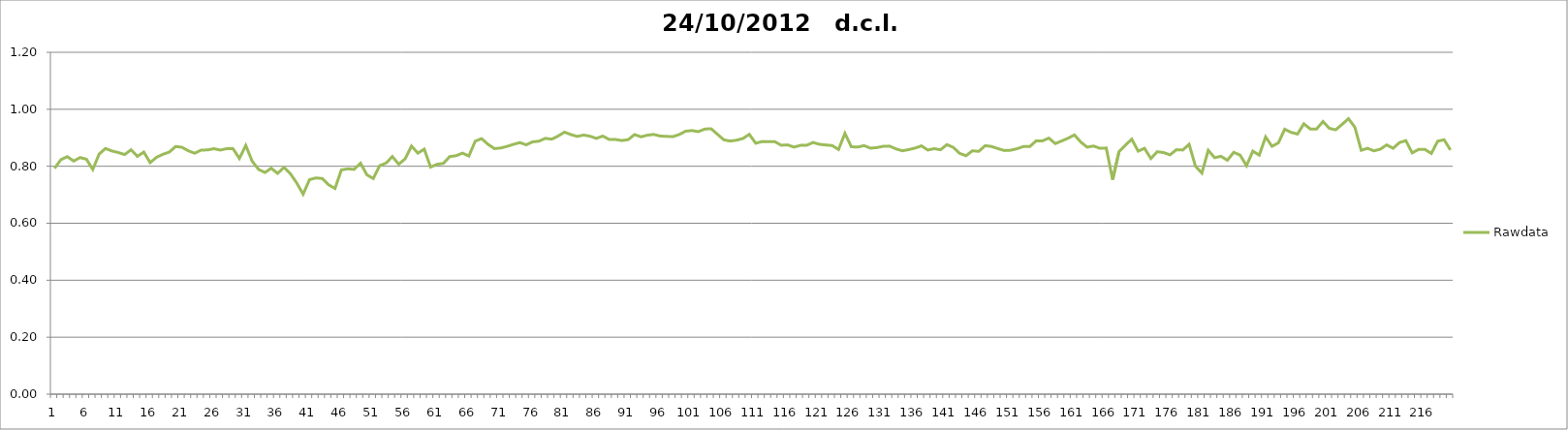
| Category | Rawdata |
|---|---|
| 0 | 0.793 |
| 1 | 0.823 |
| 2 | 0.834 |
| 3 | 0.818 |
| 4 | 0.83 |
| 5 | 0.825 |
| 6 | 0.789 |
| 7 | 0.843 |
| 8 | 0.862 |
| 9 | 0.854 |
| 10 | 0.848 |
| 11 | 0.841 |
| 12 | 0.858 |
| 13 | 0.835 |
| 14 | 0.85 |
| 15 | 0.813 |
| 16 | 0.832 |
| 17 | 0.842 |
| 18 | 0.85 |
| 19 | 0.87 |
| 20 | 0.866 |
| 21 | 0.854 |
| 22 | 0.846 |
| 23 | 0.857 |
| 24 | 0.857 |
| 25 | 0.862 |
| 26 | 0.857 |
| 27 | 0.862 |
| 28 | 0.862 |
| 29 | 0.827 |
| 30 | 0.873 |
| 31 | 0.818 |
| 32 | 0.789 |
| 33 | 0.778 |
| 34 | 0.793 |
| 35 | 0.775 |
| 36 | 0.796 |
| 37 | 0.774 |
| 38 | 0.741 |
| 39 | 0.702 |
| 40 | 0.753 |
| 41 | 0.759 |
| 42 | 0.757 |
| 43 | 0.735 |
| 44 | 0.722 |
| 45 | 0.787 |
| 46 | 0.791 |
| 47 | 0.789 |
| 48 | 0.811 |
| 49 | 0.77 |
| 50 | 0.757 |
| 51 | 0.802 |
| 52 | 0.811 |
| 53 | 0.834 |
| 54 | 0.807 |
| 55 | 0.826 |
| 56 | 0.871 |
| 57 | 0.846 |
| 58 | 0.86 |
| 59 | 0.797 |
| 60 | 0.807 |
| 61 | 0.81 |
| 62 | 0.834 |
| 63 | 0.837 |
| 64 | 0.846 |
| 65 | 0.836 |
| 66 | 0.888 |
| 67 | 0.897 |
| 68 | 0.877 |
| 69 | 0.862 |
| 70 | 0.864 |
| 71 | 0.87 |
| 72 | 0.877 |
| 73 | 0.883 |
| 74 | 0.875 |
| 75 | 0.886 |
| 76 | 0.888 |
| 77 | 0.898 |
| 78 | 0.895 |
| 79 | 0.906 |
| 80 | 0.92 |
| 81 | 0.911 |
| 82 | 0.905 |
| 83 | 0.91 |
| 84 | 0.906 |
| 85 | 0.898 |
| 86 | 0.906 |
| 87 | 0.894 |
| 88 | 0.894 |
| 89 | 0.89 |
| 90 | 0.894 |
| 91 | 0.911 |
| 92 | 0.903 |
| 93 | 0.909 |
| 94 | 0.912 |
| 95 | 0.906 |
| 96 | 0.905 |
| 97 | 0.904 |
| 98 | 0.911 |
| 99 | 0.923 |
| 100 | 0.925 |
| 101 | 0.922 |
| 102 | 0.93 |
| 103 | 0.932 |
| 104 | 0.912 |
| 105 | 0.893 |
| 106 | 0.888 |
| 107 | 0.892 |
| 108 | 0.898 |
| 109 | 0.912 |
| 110 | 0.881 |
| 111 | 0.887 |
| 112 | 0.887 |
| 113 | 0.886 |
| 114 | 0.874 |
| 115 | 0.875 |
| 116 | 0.867 |
| 117 | 0.873 |
| 118 | 0.874 |
| 119 | 0.884 |
| 120 | 0.877 |
| 121 | 0.875 |
| 122 | 0.873 |
| 123 | 0.859 |
| 124 | 0.916 |
| 125 | 0.868 |
| 126 | 0.867 |
| 127 | 0.872 |
| 128 | 0.864 |
| 129 | 0.866 |
| 130 | 0.87 |
| 131 | 0.871 |
| 132 | 0.861 |
| 133 | 0.854 |
| 134 | 0.859 |
| 135 | 0.864 |
| 136 | 0.872 |
| 137 | 0.857 |
| 138 | 0.862 |
| 139 | 0.858 |
| 140 | 0.876 |
| 141 | 0.866 |
| 142 | 0.845 |
| 143 | 0.837 |
| 144 | 0.854 |
| 145 | 0.852 |
| 146 | 0.872 |
| 147 | 0.87 |
| 148 | 0.862 |
| 149 | 0.855 |
| 150 | 0.856 |
| 151 | 0.862 |
| 152 | 0.869 |
| 153 | 0.869 |
| 154 | 0.889 |
| 155 | 0.889 |
| 156 | 0.899 |
| 157 | 0.88 |
| 158 | 0.889 |
| 159 | 0.898 |
| 160 | 0.91 |
| 161 | 0.885 |
| 162 | 0.867 |
| 163 | 0.871 |
| 164 | 0.863 |
| 165 | 0.864 |
| 166 | 0.753 |
| 167 | 0.851 |
| 168 | 0.874 |
| 169 | 0.895 |
| 170 | 0.853 |
| 171 | 0.863 |
| 172 | 0.827 |
| 173 | 0.851 |
| 174 | 0.848 |
| 175 | 0.84 |
| 176 | 0.858 |
| 177 | 0.857 |
| 178 | 0.877 |
| 179 | 0.8 |
| 180 | 0.776 |
| 181 | 0.856 |
| 182 | 0.83 |
| 183 | 0.835 |
| 184 | 0.821 |
| 185 | 0.849 |
| 186 | 0.839 |
| 187 | 0.802 |
| 188 | 0.853 |
| 189 | 0.839 |
| 190 | 0.903 |
| 191 | 0.87 |
| 192 | 0.882 |
| 193 | 0.93 |
| 194 | 0.919 |
| 195 | 0.913 |
| 196 | 0.949 |
| 197 | 0.931 |
| 198 | 0.931 |
| 199 | 0.957 |
| 200 | 0.933 |
| 201 | 0.928 |
| 202 | 0.947 |
| 203 | 0.967 |
| 204 | 0.937 |
| 205 | 0.856 |
| 206 | 0.863 |
| 207 | 0.854 |
| 208 | 0.86 |
| 209 | 0.875 |
| 210 | 0.863 |
| 211 | 0.883 |
| 212 | 0.89 |
| 213 | 0.847 |
| 214 | 0.859 |
| 215 | 0.859 |
| 216 | 0.845 |
| 217 | 0.888 |
| 218 | 0.893 |
| 219 | 0.857 |